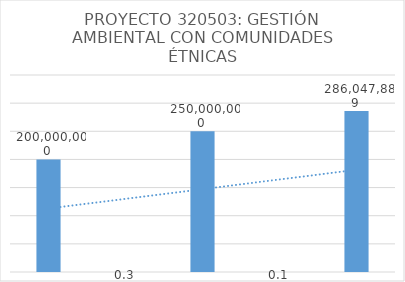
| Category | Series 0 |
|---|---|
| 0 | 200000000 |
| 1 | 0.25 |
| 2 | 250000000 |
| 3 | 0.144 |
| 4 | 286047888.876 |